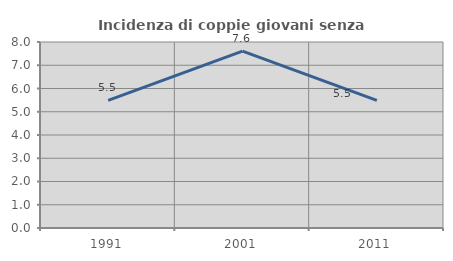
| Category | Incidenza di coppie giovani senza figli |
|---|---|
| 1991.0 | 5.485 |
| 2001.0 | 7.608 |
| 2011.0 | 5.491 |